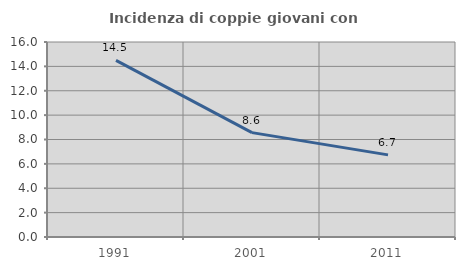
| Category | Incidenza di coppie giovani con figli |
|---|---|
| 1991.0 | 14.492 |
| 2001.0 | 8.565 |
| 2011.0 | 6.74 |